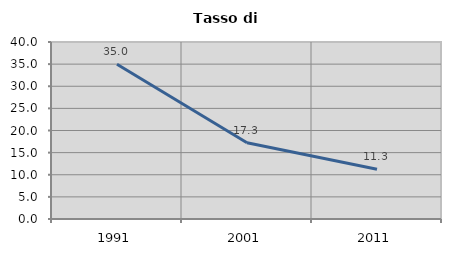
| Category | Tasso di disoccupazione   |
|---|---|
| 1991.0 | 34.97 |
| 2001.0 | 17.252 |
| 2011.0 | 11.256 |